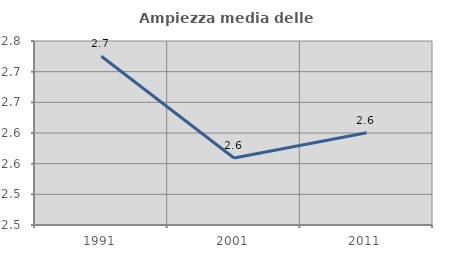
| Category | Ampiezza media delle famiglie |
|---|---|
| 1991.0 | 2.725 |
| 2001.0 | 2.559 |
| 2011.0 | 2.601 |